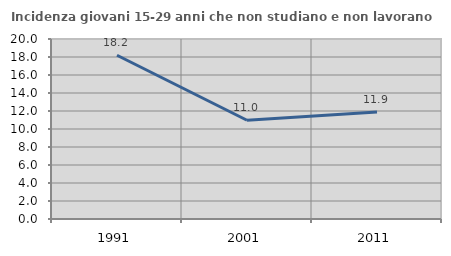
| Category | Incidenza giovani 15-29 anni che non studiano e non lavorano  |
|---|---|
| 1991.0 | 18.192 |
| 2001.0 | 10.969 |
| 2011.0 | 11.893 |